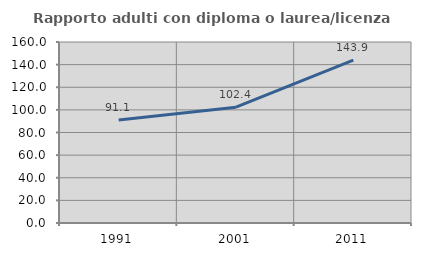
| Category | Rapporto adulti con diploma o laurea/licenza media  |
|---|---|
| 1991.0 | 91.144 |
| 2001.0 | 102.419 |
| 2011.0 | 143.915 |